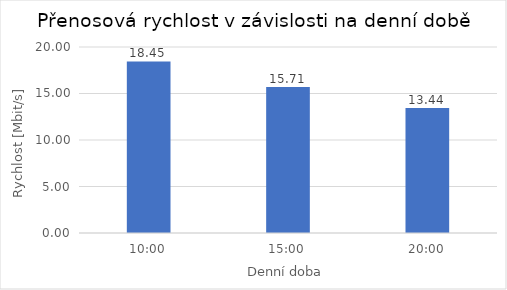
| Category | Rychlost [Mbit/s] |
|---|---|
| 0.4166666666666667 | 18.447 |
| 0.625 | 15.705 |
| 0.8333333333333334 | 13.443 |